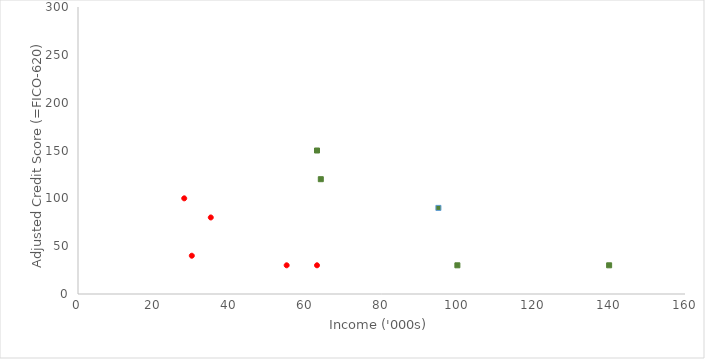
| Category | Series 0 |
|---|---|
| 30.0 | 40 |
| 55.0 | 30 |
| 63.0 | 30 |
| 35.0 | 80 |
| 28.0 | 100 |
| 140.0 | 30 |
| 100.0 | 30 |
| 95.0 | 90 |
| 64.0 | 120 |
| 63.0 | 150 |